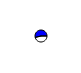
| Category | Series 0 |
|---|---|
| 0 | 6202 |
| 1 | 7241 |